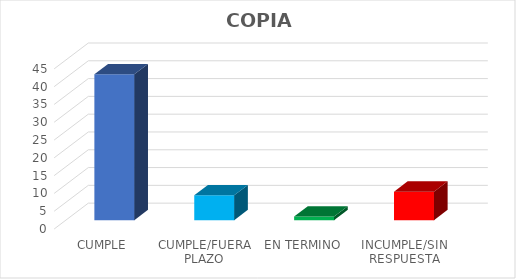
| Category | TOTAL |
|---|---|
| CUMPLE | 41 |
| CUMPLE/FUERA PLAZO | 7 |
| EN TERMINO | 1 |
| INCUMPLE/SIN RESPUESTA | 8 |